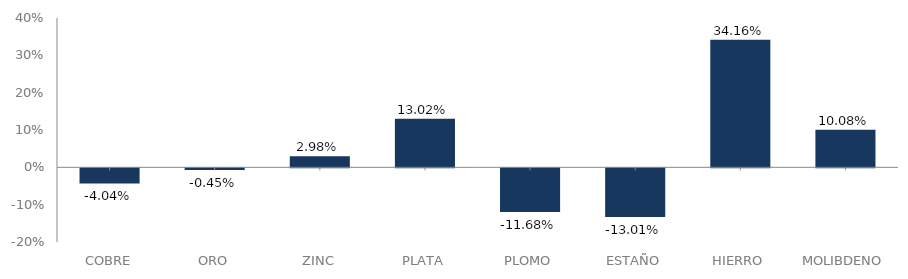
| Category | serie |
|---|---|
| 0 | -0.04 |
| 1 | -0.005 |
| 2 | 0.03 |
| 3 | 0.13 |
| 4 | -0.117 |
| 5 | -0.13 |
| 6 | 0.342 |
| 7 | 0.101 |